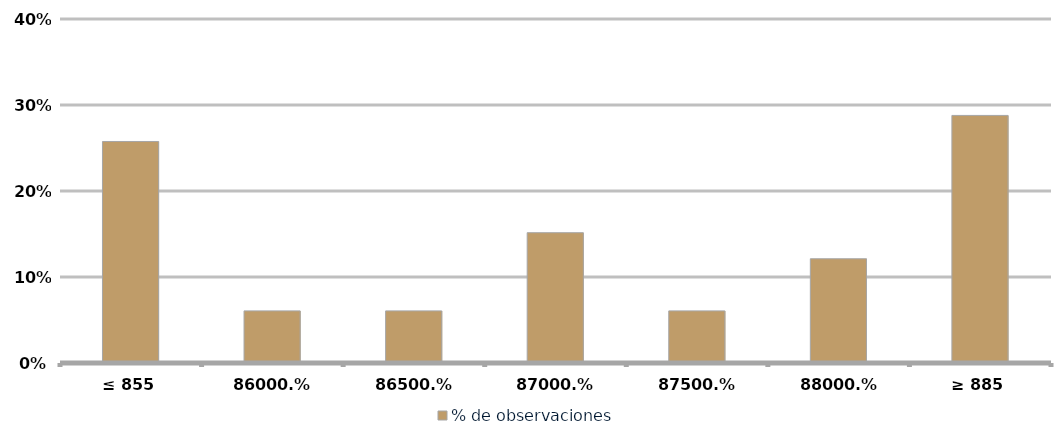
| Category | % de observaciones  |
|---|---|
| ≤ 855 | 0.258 |
| 860 | 0.061 |
| 865 | 0.061 |
| 870 | 0.152 |
| 875 | 0.061 |
| 880 | 0.121 |
| ≥ 885 | 0.288 |